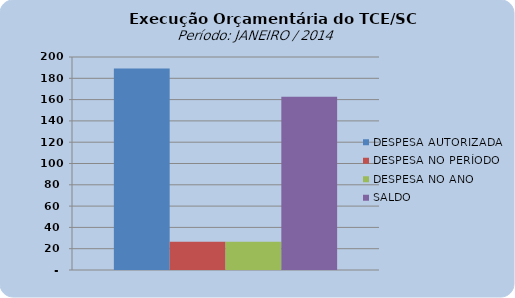
| Category | DESPESA AUTORIZADA | DESPESA NO PERÍODO | DESPESA NO ANO | SALDO |
|---|---|---|---|---|
| 0 | 189125369.47 | 26547948.28 | 26547948.28 | 162577421.19 |